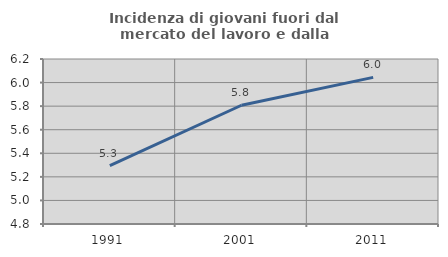
| Category | Incidenza di giovani fuori dal mercato del lavoro e dalla formazione  |
|---|---|
| 1991.0 | 5.295 |
| 2001.0 | 5.808 |
| 2011.0 | 6.044 |